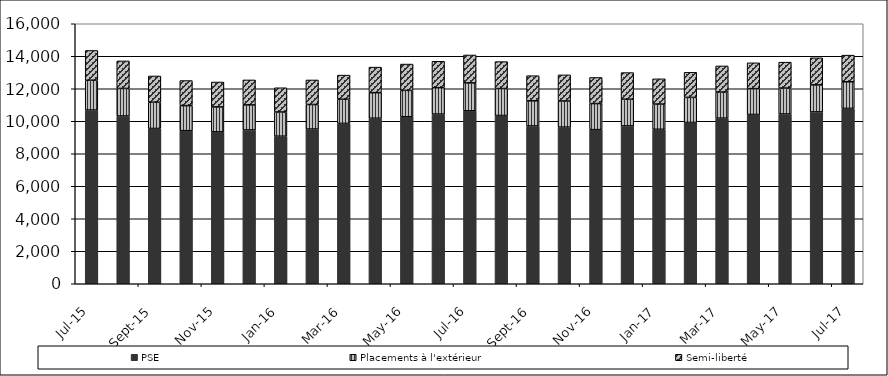
| Category | PSE | Placements à l'extérieur | Semi-liberté |
|---|---|---|---|
| 2015-07-01 | 10692 | 1832 | 1832 |
| 2015-08-01 | 10325 | 1694 | 1694 |
| 2015-09-01 | 9555 | 1616 | 1616 |
| 2015-10-01 | 9420 | 1542 | 1542 |
| 2015-11-01 | 9350 | 1533 | 1533 |
| 2015-12-01 | 9466 | 1539 | 1539 |
| 2016-01-01 | 9081 | 1490 | 1490 |
| 2016-02-01 | 9521 | 1510 | 1510 |
| 2016-03-01 | 9868 | 1486 | 1486 |
| 2016-04-01 | 10187 | 1572 | 1572 |
| 2016-05-01 | 10278 | 1621 | 1621 |
| 2016-06-01 | 10441 | 1625 | 1625 |
| 2016-07-01 | 10642 | 1718 | 1718 |
| 2016-08-01 | 10355 | 1658 | 1658 |
| 2016-09-01 | 9712 | 1546 | 1546 |
| 2016-10-01 | 9640 | 1607 | 1607 |
| 2016-11-01 | 9484 | 1605 | 1605 |
| 2016-12-01 | 9714 | 1641 | 1641 |
| 2017-01-01 | 9505 | 1553 | 1553 |
| 2017-02-01 | 9927 | 1542 | 1542 |
| 2017-03-01 | 10190 | 1607 | 1607 |
| 2017-04-01 | 10417 | 1590 | 1590 |
| 2017-05-01 | 10448 | 1594 | 1594 |
| 2017-06-01 | 10575 | 1664 | 1664 |
| 2017-07-01 | 10791 | 1639 | 1639 |